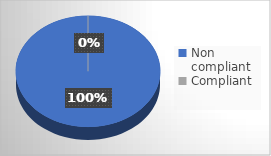
| Category | Series 0 |
|---|---|
| Non compliant | 29 |
| Compliant | 0 |